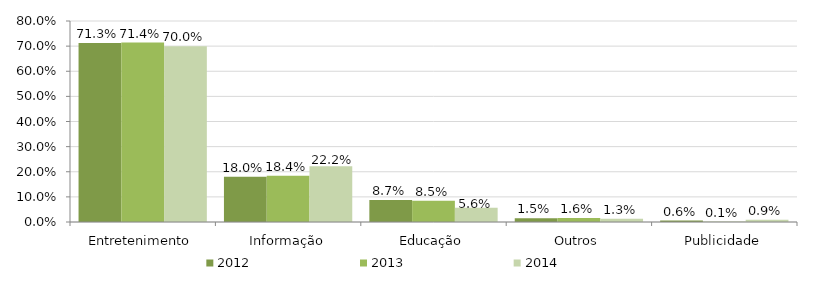
| Category | 2012 | 2013 | 2014 |
|---|---|---|---|
| Entretenimento | 0.713 | 0.714 | 0.7 |
| Informação | 0.18 | 0.184 | 0.222 |
| Educação | 0.087 | 0.085 | 0.056 |
| Outros | 0.015 | 0.016 | 0.013 |
| Publicidade | 0.006 | 0.001 | 0.009 |